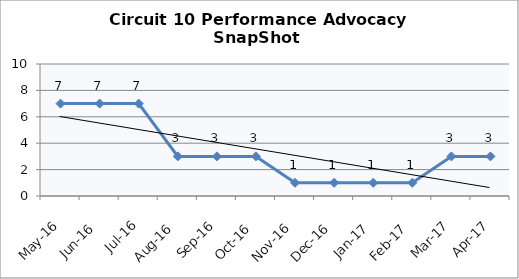
| Category | Circuit 10 |
|---|---|
| May-16 | 7 |
| Jun-16 | 7 |
| Jul-16 | 7 |
| Aug-16 | 3 |
| Sep-16 | 3 |
| Oct-16 | 3 |
| Nov-16 | 1 |
| Dec-16 | 1 |
| Jan-17 | 1 |
| Feb-17 | 1 |
| Mar-17 | 3 |
| Apr-17 | 3 |